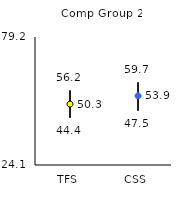
| Category | 25th | 75th | Mean |
|---|---|---|---|
| TFS | 44.4 | 56.2 | 50.32 |
| CSS | 47.5 | 59.7 | 53.87 |